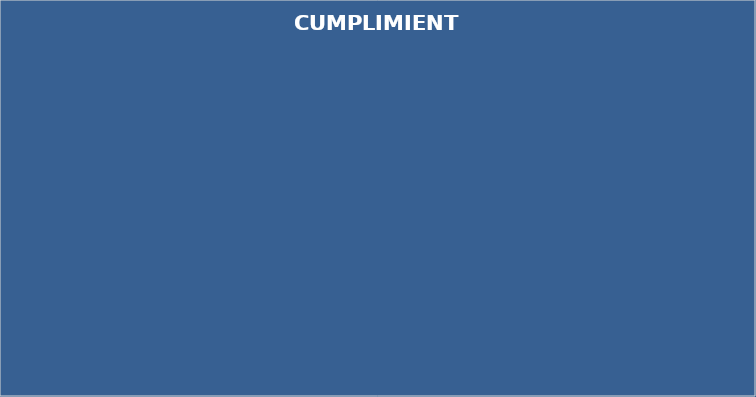
| Category | CUMPLIMIENTO |
|---|---|
| PLANEAR (RECURSOS) | 0 |
| PLANEAR (GESTIÓN INTEGRAL DEL SG-SST) | 0 |
| HACER (GESTIÓN DE LA SALUD) | 0 |
| HACER (GESTIÓN DE PELIGROS Y RIESGOS) | 0 |
| HACER (GESTIÓN DE AMENAZAS) | 0 |
| VERIFICAR (VERIFICACIÓN DEL SG-SST) | 0 |
| ACTUAR (MEJORAMIENTO) | 0 |